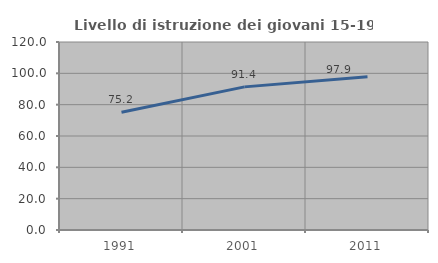
| Category | Livello di istruzione dei giovani 15-19 anni |
|---|---|
| 1991.0 | 75.214 |
| 2001.0 | 91.358 |
| 2011.0 | 97.872 |